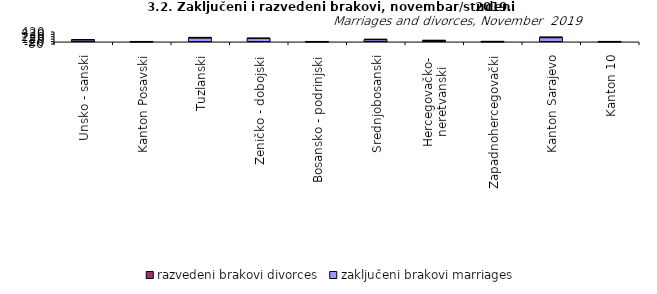
| Category | zaključeni brakovi marriages | razvedeni brakovi divorces |
|---|---|---|
| Unsko - sanski | 86 | 20 |
| Kanton Posavski | 5 | 5 |
| Tuzlanski | 163 | 34 |
| Zeničko - dobojski | 147 | 14 |
| Bosansko - podrinjski | 5 | 4 |
| Srednjobosanski | 97 | 15 |
| Hercegovačko-
neretvanski | 57 | 10 |
| Zapadnohercegovački | 11 | 2 |
| Kanton Sarajevo | 182 | 27 |
| Kanton 10 | 7 | 3 |